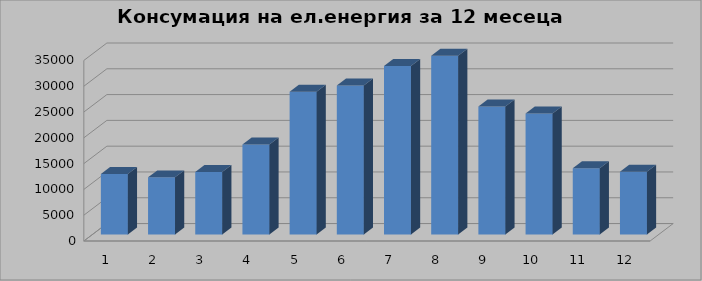
| Category | Series 0 |
|---|---|
| 0 | 11722.22 |
| 1 | 11074.64 |
| 2 | 12111.43 |
| 3 | 17462.58 |
| 4 | 27693.79 |
| 5 | 28886.06 |
| 6 | 32657.94 |
| 7 | 34668.6 |
| 8 | 24813.33 |
| 9 | 23443.09 |
| 10 | 12863.11 |
| 11 | 12184.93 |